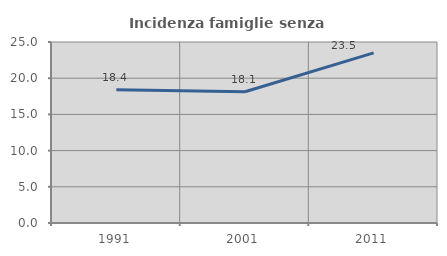
| Category | Incidenza famiglie senza nuclei |
|---|---|
| 1991.0 | 18.394 |
| 2001.0 | 18.126 |
| 2011.0 | 23.501 |